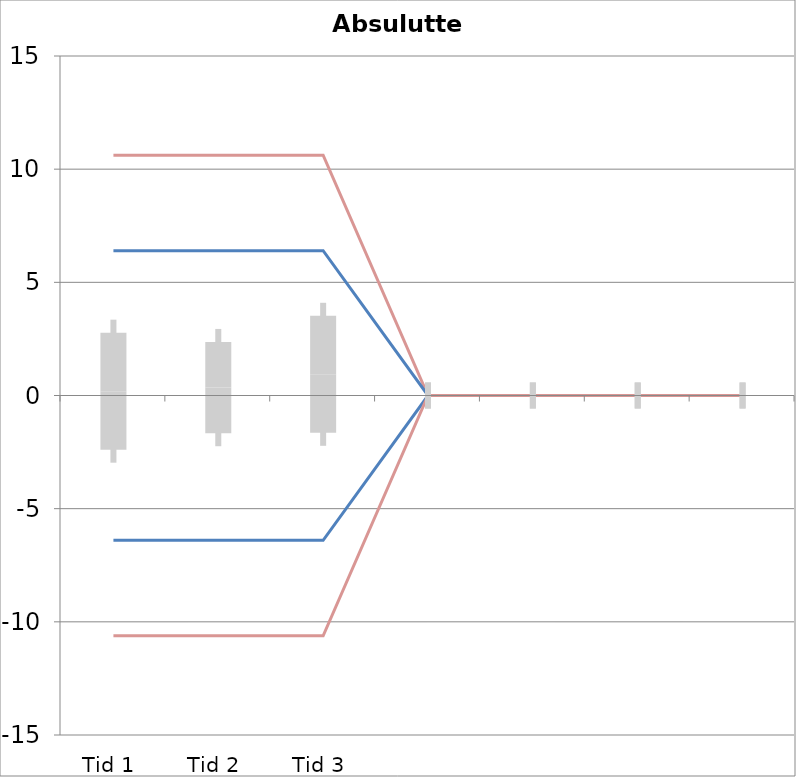
| Category | 1 | 2 | 3 | 4 | 5 | 6 | 7 | 8 | 9 | 10 | 11 | 12 | 13 | 14 | 15 | 16 | 17 | 18 | 19 | 20 | TEa | B | -B | -TEa | M |
|---|---|---|---|---|---|---|---|---|---|---|---|---|---|---|---|---|---|---|---|---|---|---|---|---|---|
| Tid 1 | 1.8 | -4.5 | 6.3 | -1.7 | -1.7 | -6.2 | -0.4 | 4.5 | -1.6 | 3.9 | 1.7 | 0 | 0 | 0 | 0 | 0 | 0 | 0 | 0 | 0 | 10.618 | 6.397 | -6.397 | -10.618 | 0.191 |
| Tid 2 | 4.7 | -4.9 | 0.7 | 1.3 | -3.4 | 1.1 | 1.5 | 2.2 | -3.7 | 2.2 | -2.1 | 4.6 | 0 | 0 | 0 | 0 | 0 | 0 | 0 | 0 | 10.618 | 6.397 | -6.397 | -10.618 | 0.35 |
| Tid 3 | 0.8 | 0 | 3.5 | 2.5 | 7.9 | -3.2 | 2.2 | 0.8 | -2.7 | 1 | -6.2 | 3.7 | 0 | 0 | 0 | 0 | 0 | 0 | 0 | 0 | 10.618 | 6.397 | -6.397 | -10.618 | 0.936 |